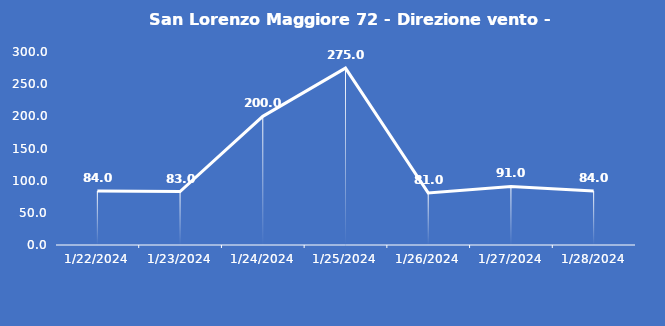
| Category | San Lorenzo Maggiore 72 - Direzione vento - Grezzo (°N) |
|---|---|
| 1/22/24 | 84 |
| 1/23/24 | 83 |
| 1/24/24 | 200 |
| 1/25/24 | 275 |
| 1/26/24 | 81 |
| 1/27/24 | 91 |
| 1/28/24 | 84 |